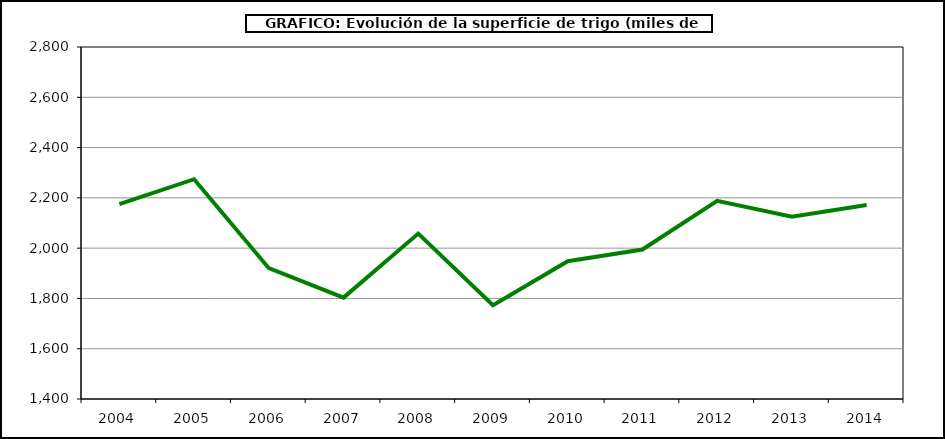
| Category | Superficie |
|---|---|
| 2004.0 | 2175.028 |
| 2005.0 | 2274.109 |
| 2006.0 | 1920.233 |
| 2007.0 | 1803.313 |
| 2008.0 | 2057.87 |
| 2009.0 | 1772.752 |
| 2010.0 | 1948.073 |
| 2011.0 | 1994.653 |
| 2012.0 | 2188.171 |
| 2013.0 | 2124.969 |
| 2014.0 | 2171.672 |